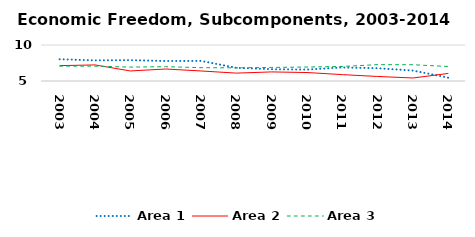
| Category | Area 1 | Area 2 | Area 3 |
|---|---|---|---|
| 2003.0 | 8.023 | 7.135 | 7.071 |
| 2004.0 | 7.863 | 7.234 | 7.062 |
| 2005.0 | 7.897 | 6.397 | 6.933 |
| 2006.0 | 7.778 | 6.665 | 6.988 |
| 2007.0 | 7.791 | 6.394 | 6.852 |
| 2008.0 | 6.834 | 6.094 | 6.825 |
| 2009.0 | 6.638 | 6.263 | 6.884 |
| 2010.0 | 6.586 | 6.178 | 6.941 |
| 2011.0 | 6.884 | 5.885 | 7.02 |
| 2012.0 | 6.776 | 5.628 | 7.269 |
| 2013.0 | 6.45 | 5.417 | 7.259 |
| 2014.0 | 5.458 | 6.052 | 7.016 |